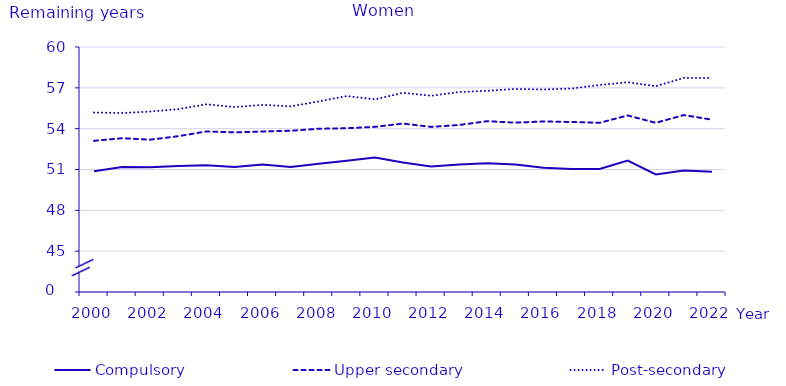
| Category | Compulsory | Upper secondary | Post-secondary |
|---|---|---|---|
| 2000.0 | 50.875 | 53.108 | 55.187 |
| 2001.0 | 51.177 | 53.296 | 55.151 |
| 2002.0 | 51.161 | 53.193 | 55.256 |
| 2003.0 | 51.259 | 53.446 | 55.434 |
| 2004.0 | 51.313 | 53.797 | 55.792 |
| 2005.0 | 51.176 | 53.728 | 55.586 |
| 2006.0 | 51.361 | 53.793 | 55.749 |
| 2007.0 | 51.188 | 53.845 | 55.637 |
| 2008.0 | 51.414 | 53.993 | 56.003 |
| 2009.0 | 51.651 | 54.031 | 56.399 |
| 2010.0 | 51.886 | 54.134 | 56.151 |
| 2011.0 | 51.511 | 54.375 | 56.635 |
| 2012.0 | 51.22 | 54.13 | 56.42 |
| 2013.0 | 51.37 | 54.27 | 56.69 |
| 2014.0 | 51.45 | 54.55 | 56.78 |
| 2015.0 | 51.36 | 54.44 | 56.92 |
| 2016.0 | 51.12 | 54.53 | 56.88 |
| 2017.0 | 51.03 | 54.49 | 56.95 |
| 2018.0 | 51.04 | 54.43 | 57.21 |
| 2019.0 | 51.66 | 54.97 | 57.41 |
| 2020.0 | 50.64 | 54.43 | 57.12 |
| 2021.0 | 50.92 | 55 | 57.73 |
| 2022.0 | 50.84 | 54.66 | 57.72 |